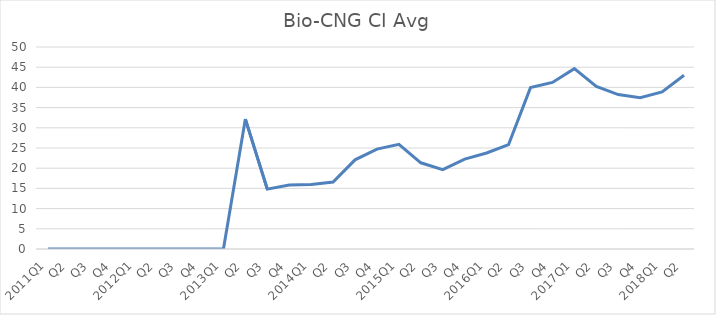
| Category | Bio-CNG CI Avg |
|---|---|
| 2011Q1 | 0 |
| Q2 | 0 |
| Q3 | 0 |
| Q4 | 0 |
| 2012Q1 | 0 |
| Q2 | 0 |
| Q3 | 0 |
| Q4 | 0 |
| 2013Q1 | 0 |
| Q2 | 32.15 |
| Q3 | 14.82 |
| Q4 | 15.85 |
| 2014Q1 | 15.99 |
| Q2 | 16.58 |
| Q3 | 22.07 |
| Q4 | 24.73 |
| 2015Q1 | 25.91 |
| Q2 | 21.34 |
| Q3 | 19.63 |
| Q4 | 22.25 |
| 2016Q1 | 23.76 |
| Q2 | 25.86 |
| Q3 | 39.95 |
| Q4 | 41.22 |
| 2017Q1 | 44.65 |
| Q2 | 40.26 |
| Q3 | 38.22 |
| Q4 | 37.46 |
| 2018Q1 | 38.88 |
| Q2 | 43.01 |